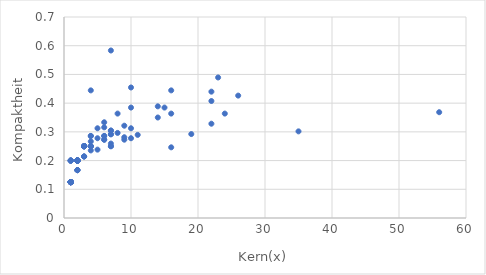
| Category | Series 0 |
|---|---|
| 1.0 | 0.2 |
| 1.0 | 0.2 |
| 1.0 | 0.2 |
| 4.0 | 0.444 |
| 9.0 | 0.273 |
| 3.0 | 0.25 |
| 1.0 | 0.125 |
| 3.0 | 0.25 |
| 1.0 | 0.125 |
| 1.0 | 0.125 |
| 16.0 | 0.444 |
| 10.0 | 0.312 |
| 2.0 | 0.2 |
| 2.0 | 0.2 |
| 5.0 | 0.312 |
| 1.0 | 0.125 |
| 1.0 | 0.125 |
| 1.0 | 0.125 |
| 3.0 | 0.25 |
| 2.0 | 0.2 |
| 1.0 | 0.125 |
| 11.0 | 0.289 |
| 2.0 | 0.2 |
| 1.0 | 0.125 |
| 7.0 | 0.25 |
| 1.0 | 0.125 |
| 1.0 | 0.125 |
| 1.0 | 0.125 |
| 1.0 | 0.125 |
| 7.0 | 0.304 |
| 1.0 | 0.125 |
| 2.0 | 0.2 |
| 2.0 | 0.2 |
| 1.0 | 0.125 |
| 7.0 | 0.25 |
| 1.0 | 0.125 |
| 3.0 | 0.25 |
| 1.0 | 0.125 |
| 1.0 | 0.125 |
| 1.0 | 0.125 |
| 22.0 | 0.407 |
| 1.0 | 0.125 |
| 3.0 | 0.25 |
| 1.0 | 0.125 |
| 4.0 | 0.267 |
| 6.0 | 0.286 |
| 1.0 | 0.125 |
| 5.0 | 0.278 |
| 7.0 | 0.259 |
| 1.0 | 0.125 |
| 3.0 | 0.214 |
| 9.0 | 0.321 |
| 16.0 | 0.364 |
| 1.0 | 0.125 |
| 19.0 | 0.292 |
| 1.0 | 0.125 |
| 1.0 | 0.125 |
| 1.0 | 0.125 |
| 1.0 | 0.125 |
| 4.0 | 0.25 |
| 4.0 | 0.286 |
| 4.0 | 0.25 |
| 35.0 | 0.302 |
| 1.0 | 0.125 |
| 3.0 | 0.25 |
| 1.0 | 0.125 |
| 2.0 | 0.2 |
| 1.0 | 0.125 |
| 1.0 | 0.125 |
| 1.0 | 0.125 |
| 1.0 | 0.125 |
| 56.0 | 0.368 |
| 2.0 | 0.2 |
| 14.0 | 0.35 |
| 9.0 | 0.281 |
| 1.0 | 0.125 |
| 2.0 | 0.2 |
| 22.0 | 0.44 |
| 1.0 | 0.125 |
| 1.0 | 0.125 |
| 1.0 | 0.125 |
| 2.0 | 0.2 |
| 1.0 | 0.125 |
| 22.0 | 0.328 |
| 2.0 | 0.167 |
| 2.0 | 0.167 |
| 1.0 | 0.125 |
| 1.0 | 0.125 |
| 1.0 | 0.125 |
| 7.0 | 0.583 |
| 1.0 | 0.125 |
| 1.0 | 0.125 |
| 14.0 | 0.389 |
| 1.0 | 0.125 |
| 1.0 | 0.2 |
| 3.0 | 0.25 |
| 23.0 | 0.489 |
| 1.0 | 0.125 |
| 3.0 | 0.25 |
| 1.0 | 0.125 |
| 1.0 | 0.125 |
| 2.0 | 0.167 |
| 1.0 | 0.125 |
| 16.0 | 0.246 |
| 2.0 | 0.2 |
| 1.0 | 0.125 |
| 1.0 | 0.125 |
| 1.0 | 0.125 |
| 1.0 | 0.2 |
| 8.0 | 0.296 |
| 6.0 | 0.316 |
| 1.0 | 0.125 |
| 7.0 | 0.292 |
| 1.0 | 0.125 |
| 2.0 | 0.2 |
| 1.0 | 0.125 |
| 1.0 | 0.125 |
| 4.0 | 0.25 |
| 2.0 | 0.2 |
| 6.0 | 0.273 |
| 4.0 | 0.235 |
| 2.0 | 0.2 |
| 1.0 | 0.125 |
| 3.0 | 0.214 |
| 3.0 | 0.25 |
| 1.0 | 0.125 |
| 10.0 | 0.278 |
| 1.0 | 0.125 |
| 1.0 | 0.125 |
| 1.0 | 0.125 |
| 5.0 | 0.238 |
| 1.0 | 0.125 |
| 1.0 | 0.125 |
| 1.0 | 0.125 |
| 8.0 | 0.364 |
| 26.0 | 0.426 |
| 2.0 | 0.167 |
| 15.0 | 0.385 |
| 2.0 | 0.2 |
| 24.0 | 0.364 |
| 1.0 | 0.125 |
| 3.0 | 0.214 |
| 1.0 | 0.125 |
| 1.0 | 0.125 |
| 1.0 | 0.125 |
| 1.0 | 0.125 |
| 7.0 | 0.292 |
| 1.0 | 0.125 |
| 10.0 | 0.385 |
| 4.0 | 0.286 |
| 1.0 | 0.125 |
| 1.0 | 0.125 |
| 1.0 | 0.125 |
| 1.0 | 0.125 |
| 6.0 | 0.286 |
| 1.0 | 0.125 |
| 4.0 | 0.25 |
| 1.0 | 0.125 |
| 6.0 | 0.273 |
| 1.0 | 0.125 |
| 1.0 | 0.125 |
| 7.0 | 0.304 |
| 10.0 | 0.455 |
| 3.0 | 0.25 |
| 6.0 | 0.333 |
| 1.0 | 0.125 |
| 1.0 | 0.125 |
| 3.0 | 0.25 |